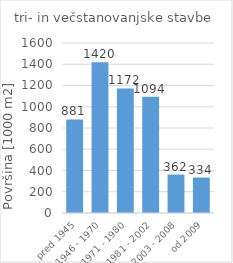
| Category | Series 0 |
|---|---|
| pred 1945 | 881155.7 |
| 1946 - 1970 | 1419726.2 |
| 1971 - 1980 | 1172439.7 |
| 1981 - 2002 | 1094355.5 |
| 2003 - 2008 | 361846.2 |
| od 2009 | 334046.5 |